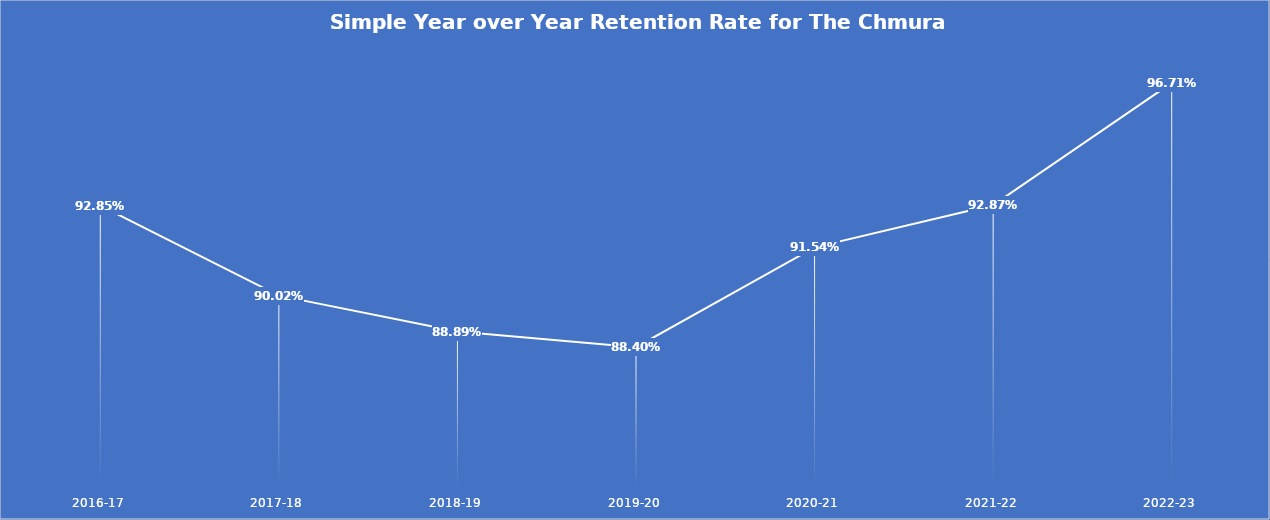
| Category | Series 0 |
|---|---|
| 2016-17 | 0.928 |
| 2017-18 | 0.9 |
| 2018-19 | 0.889 |
| 2019-20 | 0.884 |
| 2020-21 | 0.915 |
| 2021-22 | 0.929 |
| 2022-23 | 0.967 |